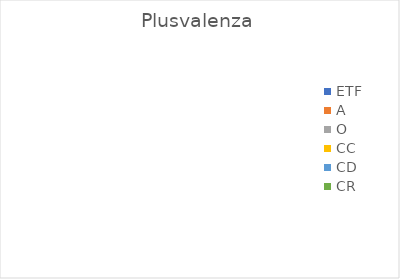
| Category | Plusvalenza |
|---|---|
| ETF | 0 |
| A | 0 |
| O | 0 |
| CC | 0 |
| CD | 0 |
| CR | 0 |